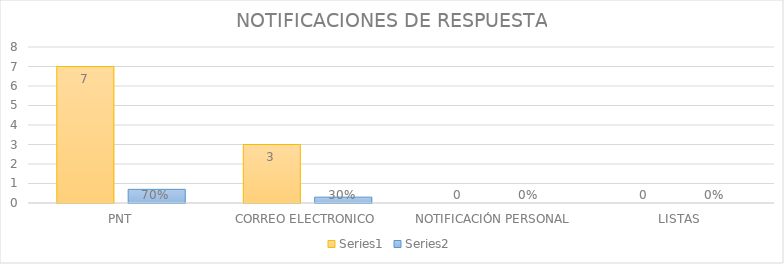
| Category | Series 3 | Series 4 |
|---|---|---|
| PNT | 7 | 0.7 |
| CORREO ELECTRONICO | 3 | 0.3 |
| NOTIFICACIÓN PERSONAL | 0 | 0 |
| LISTAS | 0 | 0 |